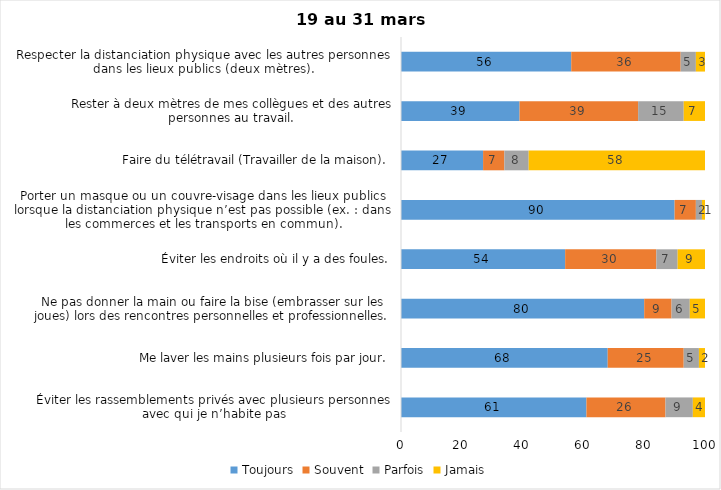
| Category | Toujours | Souvent | Parfois | Jamais |
|---|---|---|---|---|
| Éviter les rassemblements privés avec plusieurs personnes avec qui je n’habite pas | 61 | 26 | 9 | 4 |
| Me laver les mains plusieurs fois par jour. | 68 | 25 | 5 | 2 |
| Ne pas donner la main ou faire la bise (embrasser sur les joues) lors des rencontres personnelles et professionnelles. | 80 | 9 | 6 | 5 |
| Éviter les endroits où il y a des foules. | 54 | 30 | 7 | 9 |
| Porter un masque ou un couvre-visage dans les lieux publics lorsque la distanciation physique n’est pas possible (ex. : dans les commerces et les transports en commun). | 90 | 7 | 2 | 1 |
| Faire du télétravail (Travailler de la maison). | 27 | 7 | 8 | 58 |
| Rester à deux mètres de mes collègues et des autres personnes au travail. | 39 | 39 | 15 | 7 |
| Respecter la distanciation physique avec les autres personnes dans les lieux publics (deux mètres). | 56 | 36 | 5 | 3 |